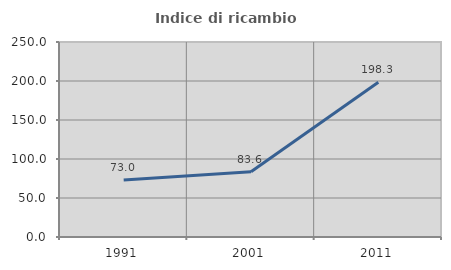
| Category | Indice di ricambio occupazionale  |
|---|---|
| 1991.0 | 72.996 |
| 2001.0 | 83.648 |
| 2011.0 | 198.333 |